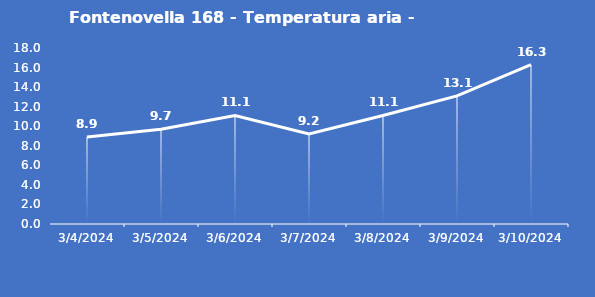
| Category | Fontenovella 168 - Temperatura aria - Grezzo (°C) |
|---|---|
| 3/4/24 | 8.9 |
| 3/5/24 | 9.7 |
| 3/6/24 | 11.1 |
| 3/7/24 | 9.2 |
| 3/8/24 | 11.1 |
| 3/9/24 | 13.1 |
| 3/10/24 | 16.3 |